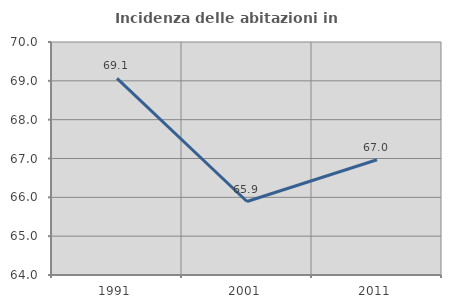
| Category | Incidenza delle abitazioni in proprietà  |
|---|---|
| 1991.0 | 69.064 |
| 2001.0 | 65.892 |
| 2011.0 | 66.966 |